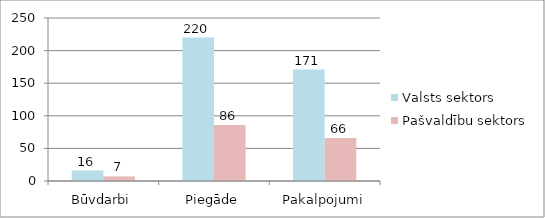
| Category | Valsts sektors | Pašvaldību sektors |
|---|---|---|
| Būvdarbi | 16 | 7 |
| Piegāde | 220 | 86 |
| Pakalpojumi | 171 | 66 |